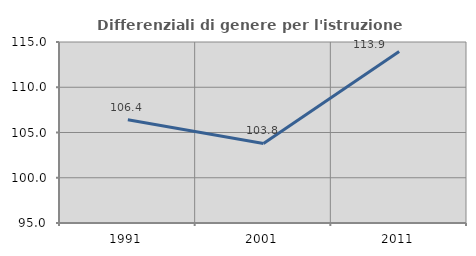
| Category | Differenziali di genere per l'istruzione superiore |
|---|---|
| 1991.0 | 106.41 |
| 2001.0 | 103.786 |
| 2011.0 | 113.947 |